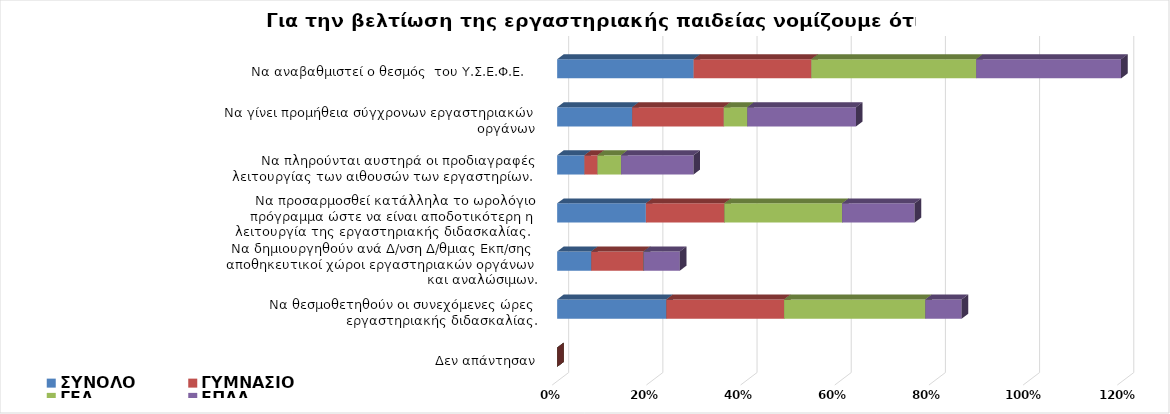
| Category | ΣΥΝΟΛΟ | ΓΥΜΝΑΣΙΟ | ΓΕΛ | ΕΠΑΛ |
|---|---|---|---|---|
| Να αναβαθμιστεί ο θεσμός  του Υ.Σ.Ε.Φ.Ε.  | 0.29 | 0.25 | 0.35 | 0.308 |
| Να γίνει προμήθεια σύγχρονων εργαστηριακών οργάνων  | 0.159 | 0.194 | 0.05 | 0.231 |
| Nα πληρούνται αυστηρά οι προδιαγραφές λειτουργίας των αιθουσών των εργαστηρίων. | 0.058 | 0.028 | 0.05 | 0.154 |
| Να προσαρμοσθεί κατάλληλα το ωρολόγιο πρόγραμμα ώστε να είναι αποδοτικότερη η λειτουργία της εργαστηριακής διδασκαλίας.  | 0.188 | 0.167 | 0.25 | 0.154 |
| Να δημιουργηθούν ανά Δ/νση Δ/θμιας Εκπ/σης αποθηκευτικοί χώροι εργαστηριακών οργάνων και αναλώσιμων. | 0.072 | 0.111 | 0 | 0.077 |
| Να θεσμοθετηθούν οι συνεχόμενες ώρες εργαστηριακής διδασκαλίας. | 0.232 | 0.25 | 0.3 | 0.077 |
| Δεν απάντησαν | 0 | 0 | 0 | 0 |